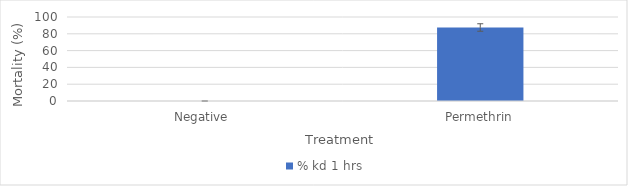
| Category | % kd 1 hrs |
|---|---|
| Negative  | 0 |
| Permethrin | 87.5 |